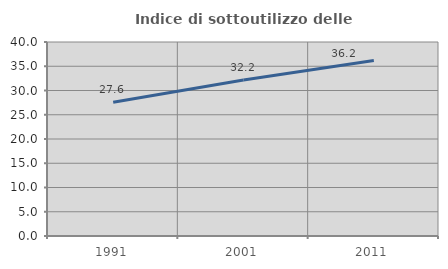
| Category | Indice di sottoutilizzo delle abitazioni  |
|---|---|
| 1991.0 | 27.577 |
| 2001.0 | 32.168 |
| 2011.0 | 36.166 |